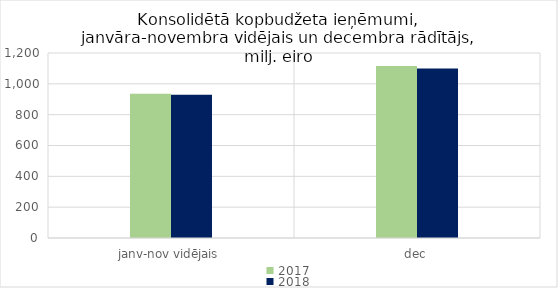
| Category | 2017 | 2018 |
|---|---|---|
| janv-nov vidējais | 936209.314 | 929242.433 |
| dec | 1116052.897 | 1098839.178 |